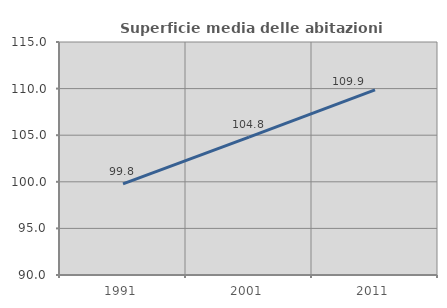
| Category | Superficie media delle abitazioni occupate |
|---|---|
| 1991.0 | 99.783 |
| 2001.0 | 104.787 |
| 2011.0 | 109.864 |